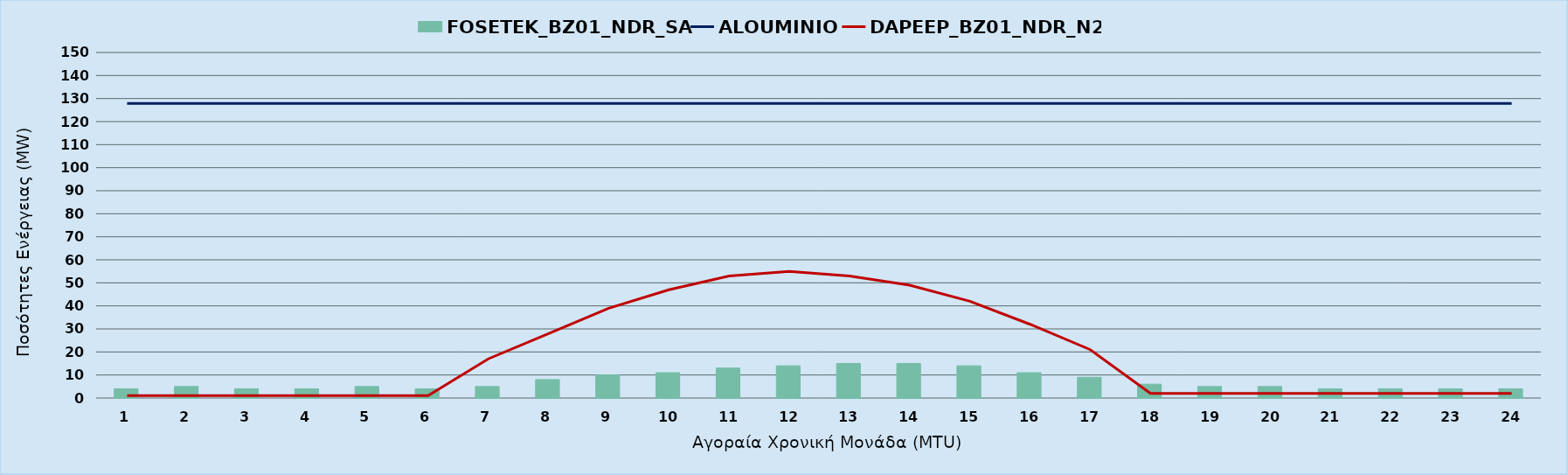
| Category | FOSETEK_BZ01_NDR_SA |
|---|---|
| 0 | 4 |
| 1 | 5 |
| 2 | 4 |
| 3 | 4 |
| 4 | 5 |
| 5 | 4 |
| 6 | 5 |
| 7 | 8 |
| 8 | 10 |
| 9 | 11 |
| 10 | 13 |
| 11 | 14 |
| 12 | 15 |
| 13 | 15 |
| 14 | 14 |
| 15 | 11 |
| 16 | 9 |
| 17 | 6 |
| 18 | 5 |
| 19 | 5 |
| 20 | 4 |
| 21 | 4 |
| 22 | 4 |
| 23 | 4 |